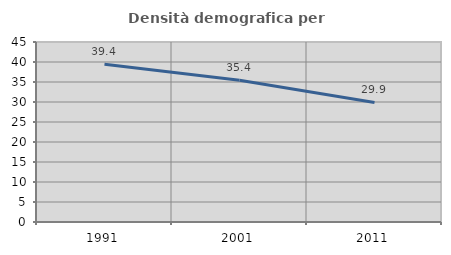
| Category | Densità demografica |
|---|---|
| 1991.0 | 39.416 |
| 2001.0 | 35.45 |
| 2011.0 | 29.898 |